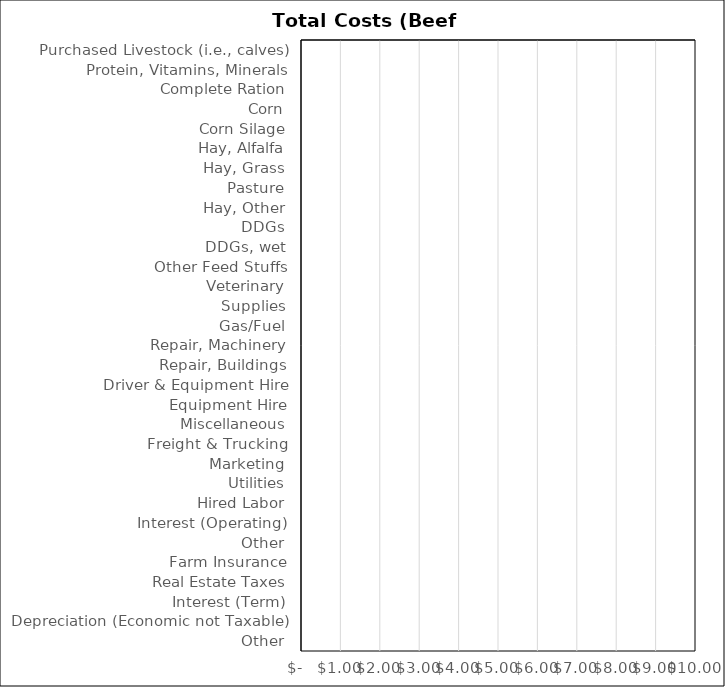
| Category | Beef Cow Calf |
|---|---|
| Purchased Livestock (i.e., calves) | 0 |
| Protein, Vitamins, Minerals | 0 |
| Complete Ration | 0 |
| Corn | 0 |
| Corn Silage | 0 |
| Hay, Alfalfa | 0 |
| Hay, Grass | 0 |
| Pasture | 0 |
| Hay, Other | 0 |
| DDGs | 0 |
| DDGs, wet | 0 |
| Other Feed Stuffs | 0 |
| Veterinary | 0 |
| Supplies | 0 |
| Gas/Fuel | 0 |
| Repair, Machinery | 0 |
| Repair, Buildings | 0 |
| Driver & Equipment Hire | 0 |
| Equipment Hire | 0 |
| Miscellaneous | 0 |
| Freight & Trucking | 0 |
| Marketing | 0 |
| Utilities | 0 |
| Hired Labor | 0 |
| Interest (Operating) | 0 |
| Other | 0 |
| Farm Insurance | 0 |
| Real Estate Taxes | 0 |
| Interest (Term) | 0 |
| Depreciation (Economic not Taxable) | 0 |
| Other | 0 |